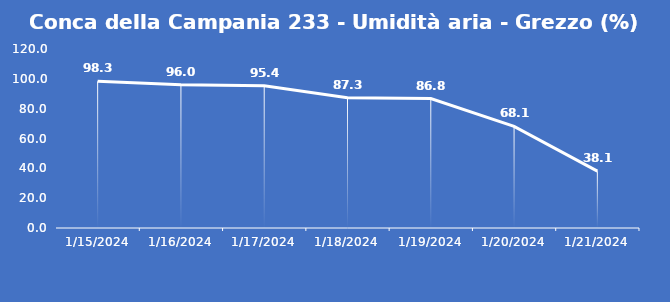
| Category | Conca della Campania 233 - Umidità aria - Grezzo (%) |
|---|---|
| 1/15/24 | 98.3 |
| 1/16/24 | 96 |
| 1/17/24 | 95.4 |
| 1/18/24 | 87.3 |
| 1/19/24 | 86.8 |
| 1/20/24 | 68.1 |
| 1/21/24 | 38.1 |